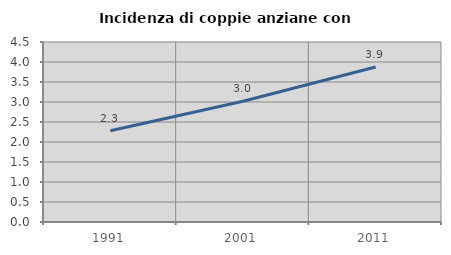
| Category | Incidenza di coppie anziane con figli |
|---|---|
| 1991.0 | 2.281 |
| 2001.0 | 3.019 |
| 2011.0 | 3.876 |